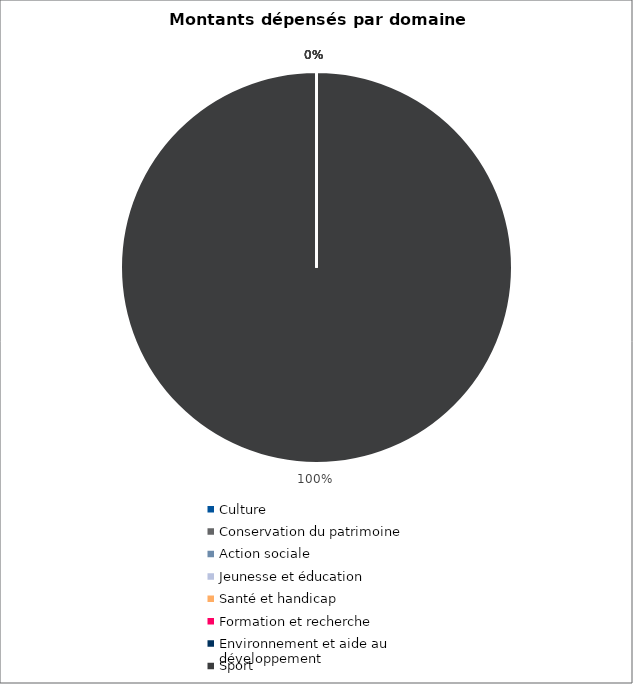
| Category | Series 0 |
|---|---|
| Culture | 0 |
| Conservation du patrimoine | 0 |
| Action sociale | 0 |
| Jeunesse et éducation | 0 |
| Santé et handicap | 0 |
| Formation et recherche | 0 |
| Environnement et aide au
développement | 0 |
| Sport | 5207124 |
| Autres projets d’utilité publique | 0 |